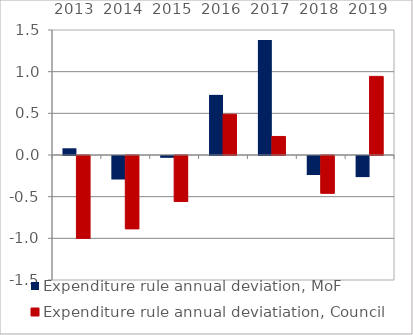
| Category | Expenditure rule annual deviation, MoF | Expenditure rule annual deviatiation, Council |
|---|---|---|
| 2013.0 | 0.081 | -0.993 |
| 2014.0 | -0.282 | -0.878 |
| 2015.0 | -0.022 | -0.55 |
| 2016.0 | 0.721 | 0.489 |
| 2017.0 | 1.38 | 0.223 |
| 2018.0 | -0.228 | -0.452 |
| 2019.0 | -0.253 | 0.943 |